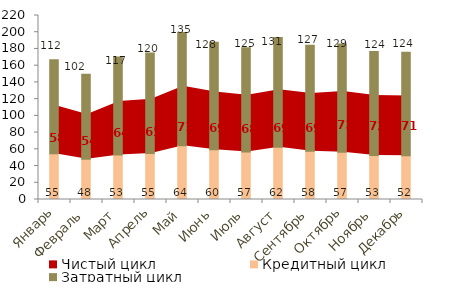
| Category | Кредитный цикл | Затратный цикл |
|---|---|---|
| Январь | 54.815 | 112.388 |
| Февраль | 48.118 | 101.751 |
| Март | 53.198 | 117.047 |
| Апрель | 55.104 | 119.968 |
| Май | 64.268 | 135.307 |
| Июнь | 59.514 | 128.403 |
| Июль | 56.78 | 124.674 |
| Август | 62.452 | 131.251 |
| Сентябрь | 57.71 | 126.838 |
| Октябрь | 56.554 | 129.261 |
| Ноябрь | 52.608 | 124.28 |
| Декабрь | 52.27 | 123.65 |